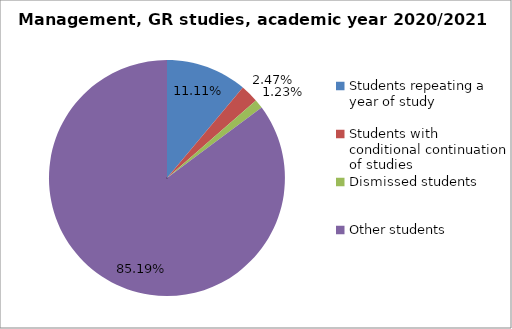
| Category | Series 0 |
|---|---|
| Students repeating a year of study | 9 |
| Students with conditional continuation of studies | 2 |
| Dismissed students | 1 |
| Other students | 69 |